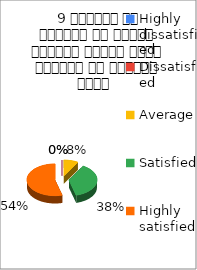
| Category |  9 शिक्षक ने शिक्षण के दौरान आधुनिक तकनीक पावर पॉइन्ट का प्रयोग किया   |
|---|---|
| Highly dissatisfied | 0 |
| Dissatisfied | 0 |
| Average | 2 |
| Satisfied | 9 |
| Highly satisfied | 13 |